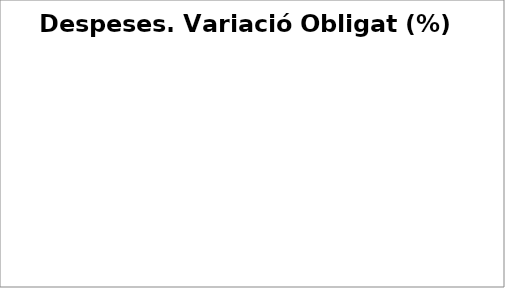
| Category | Series 0 |
|---|---|
| Despeses de personal | 0.008 |
| Despeses en béns corrents i serveis | 0.046 |
| Despeses financeres | -0.231 |
| Transferències corrents | 0.054 |
| Fons de contingència | 0 |
| Inversions reals | 0.623 |
| Transferències de capital | 0.286 |
| Actius financers | 0.661 |
| Passius financers | 0.23 |